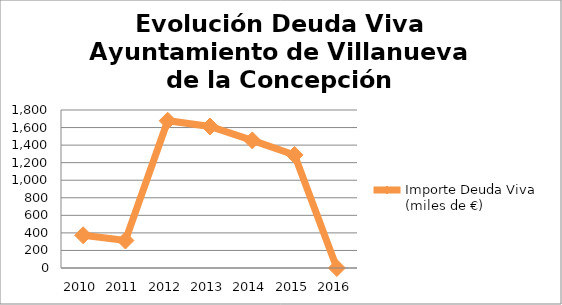
| Category | Importe Deuda Viva (miles de €) |
|---|---|
| 2010.0 | 373 |
| 2011.0 | 313 |
| 2012.0 | 1677.854 |
| 2013.0 | 1611.855 |
| 2014.0 | 1453.739 |
| 2015.0 | 1288 |
| 2016.0 | 0 |